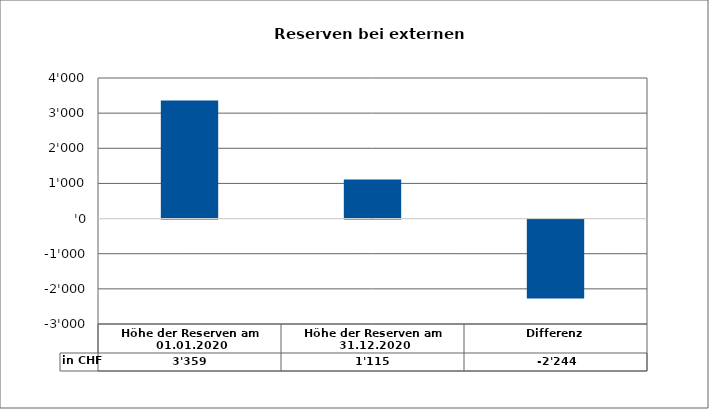
| Category | in CHF |
|---|---|
| Höhe der Reserven am 01.01.2020 | 3359 |
| Höhe der Reserven am 31.12.2020 | 1115 |
| Differenz | -2244 |